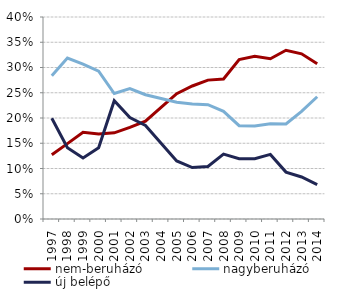
| Category | nem-beruházó | nagyberuházó | új belépő |
|---|---|---|---|
| 1997.0 | 0.127 | 0.284 | 0.2 |
| 1998.0 | 0.149 | 0.319 | 0.141 |
| 1999.0 | 0.172 | 0.307 | 0.121 |
| 2000.0 | 0.168 | 0.293 | 0.141 |
| 2001.0 | 0.171 | 0.249 | 0.234 |
| 2002.0 | 0.181 | 0.258 | 0.201 |
| 2003.0 | 0.194 | 0.246 | 0.185 |
| 2004.0 | 0.221 | 0.239 | 0.15 |
| 2005.0 | 0.248 | 0.231 | 0.115 |
| 2006.0 | 0.263 | 0.228 | 0.102 |
| 2007.0 | 0.275 | 0.226 | 0.104 |
| 2008.0 | 0.277 | 0.213 | 0.128 |
| 2009.0 | 0.316 | 0.185 | 0.119 |
| 2010.0 | 0.322 | 0.184 | 0.119 |
| 2011.0 | 0.317 | 0.188 | 0.128 |
| 2012.0 | 0.334 | 0.188 | 0.093 |
| 2013.0 | 0.327 | 0.213 | 0.083 |
| 2014.0 | 0.307 | 0.242 | 0.068 |